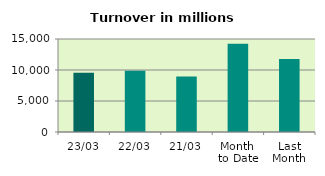
| Category | Series 0 |
|---|---|
| 23/03 | 9570.459 |
| 22/03 | 9882.788 |
| 21/03 | 8955.631 |
| Month 
to Date | 14231.977 |
| Last
Month | 11787.675 |